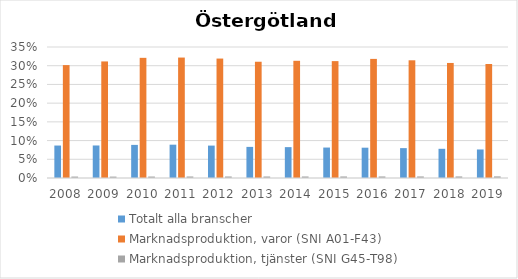
| Category | Totalt alla branscher | Marknadsproduktion, varor (SNI A01-F43) | Marknadsproduktion, tjänster (SNI G45-T98) |
|---|---|---|---|
| 2008.0 | 0.087 | 0.302 | 0.004 |
| 2009.0 | 0.087 | 0.311 | 0.004 |
| 2010.0 | 0.088 | 0.321 | 0.004 |
| 2011.0 | 0.089 | 0.322 | 0.004 |
| 2012.0 | 0.087 | 0.319 | 0.004 |
| 2013.0 | 0.083 | 0.311 | 0.004 |
| 2014.0 | 0.082 | 0.313 | 0.004 |
| 2015.0 | 0.081 | 0.312 | 0.004 |
| 2016.0 | 0.081 | 0.318 | 0.004 |
| 2017.0 | 0.08 | 0.314 | 0.004 |
| 2018.0 | 0.078 | 0.307 | 0.004 |
| 2019.0 | 0.076 | 0.305 | 0.004 |